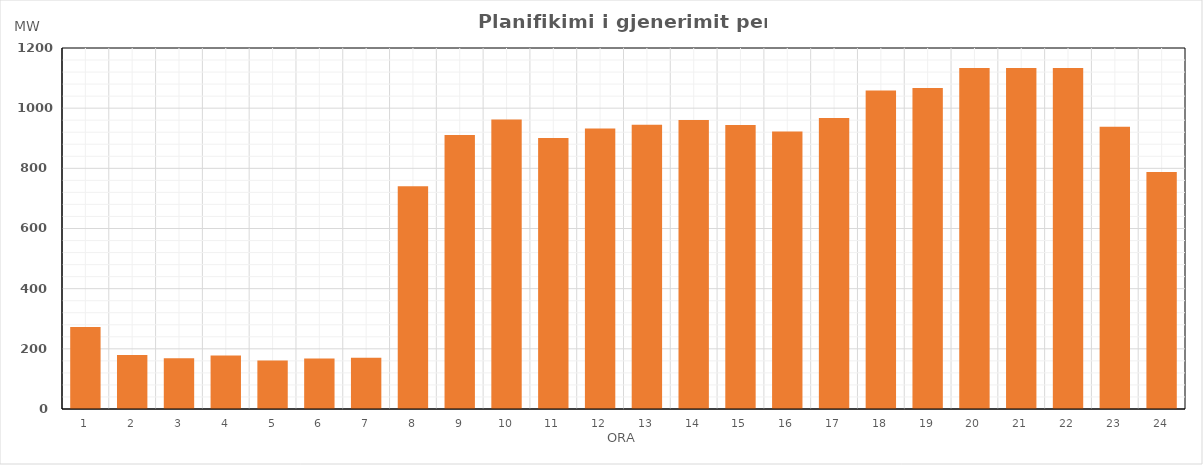
| Category | Max (MW) |
|---|---|
| 0 | 272.358 |
| 1 | 179.639 |
| 2 | 168.614 |
| 3 | 177.636 |
| 4 | 161.573 |
| 5 | 167.483 |
| 6 | 170.45 |
| 7 | 740.221 |
| 8 | 910.561 |
| 9 | 961.92 |
| 10 | 900.545 |
| 11 | 932.778 |
| 12 | 944.788 |
| 13 | 960.954 |
| 14 | 943.805 |
| 15 | 922.679 |
| 16 | 967.581 |
| 17 | 1059.141 |
| 18 | 1067.177 |
| 19 | 1133.154 |
| 20 | 1133.208 |
| 21 | 1133.293 |
| 22 | 938.026 |
| 23 | 788.14 |